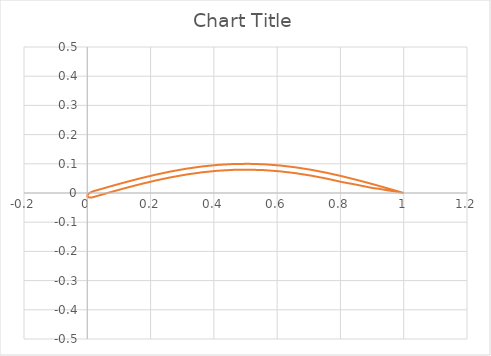
| Category | Series 1 |
|---|---|
| 1.0 | 0 |
| 0.9705882352941176 | 0.009 |
| 0.9509803921568627 | 0.015 |
| 0.9019607843137255 | 0.03 |
| 0.8529411764705882 | 0.045 |
| 0.803921568627451 | 0.058 |
| 0.7549019607843137 | 0.07 |
| 0.7058823529411764 | 0.08 |
| 0.6568627450980392 | 0.088 |
| 0.6078431372549019 | 0.094 |
| 0.5588235294117647 | 0.098 |
| 0.5098039215686274 | 0.1 |
| 0.4607843137254902 | 0.099 |
| 0.411764705882353 | 0.096 |
| 0.3627450980392157 | 0.091 |
| 0.3137254901960784 | 0.083 |
| 0.2647058823529412 | 0.074 |
| 0.21568627450980393 | 0.063 |
| 0.16666666666666666 | 0.05 |
| 0.11764705882352942 | 0.036 |
| 0.08823529411764706 | 0.027 |
| 0.06862745098039216 | 0.021 |
| 0.0392156862745098 | 0.012 |
| 0.0196078431372549 | 0.006 |
| 0.014532959899950574 | 0.004 |
| 0.009803921568627453 | 0.002 |
| 0.005743004290459854 | -0.001 |
| 0.0026269528669717913 | -0.004 |
| 0.0006681210531555228 | -0.007 |
| 0.0 | -0.01 |
| 0.0006681210531555228 | -0.012 |
| 0.0026269528669717913 | -0.014 |
| 0.005743004290459851 | -0.015 |
| 0.009803921568627453 | -0.016 |
| 0.014532959899950567 | -0.015 |
| 0.019607843137254898 | -0.014 |
| 0.0392156862745098 | -0.008 |
| 0.06862745098039216 | 0.001 |
| 0.08823529411764706 | 0.007 |
| 0.11764705882352942 | 0.016 |
| 0.16666666666666666 | 0.03 |
| 0.21568627450980393 | 0.043 |
| 0.2647058823529412 | 0.054 |
| 0.3137254901960784 | 0.063 |
| 0.3627450980392157 | 0.071 |
| 0.411764705882353 | 0.076 |
| 0.4607843137254902 | 0.079 |
| 0.5098039215686274 | 0.08 |
| 0.5588235294117647 | 0.078 |
| 0.6078431372549019 | 0.074 |
| 0.6568627450980392 | 0.068 |
| 0.7058823529411764 | 0.06 |
| 0.7549019607843137 | 0.05 |
| 0.803921568627451 | 0.038 |
| 0.8529411764705882 | 0.028 |
| 0.9019607843137255 | 0.017 |
| 0.9215686274509804 | 0.014 |
| 0.9509803921568627 | 0.009 |
| 0.9705882352941176 | 0.006 |
| 1.0 | 0 |